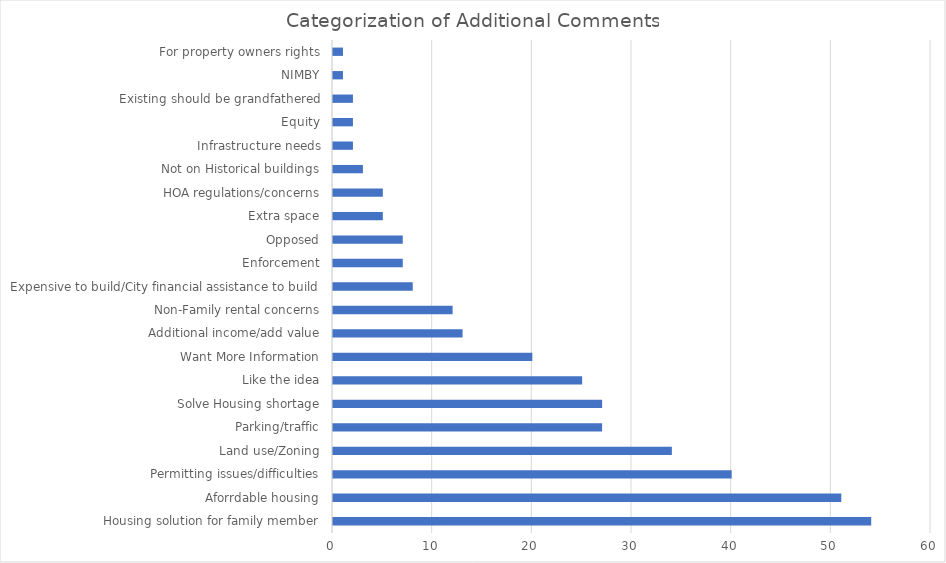
| Category | Series 0 |
|---|---|
| Housing solution for family member | 54 |
| Aforrdable housing | 51 |
| Permitting issues/difficulties | 40 |
| Land use/Zoning | 34 |
| Parking/traffic | 27 |
| Solve Housing shortage | 27 |
| Like the idea | 25 |
| Want More Information | 20 |
| Additional income/add value | 13 |
| Non-Family rental concerns | 12 |
| Expensive to build/City financial assistance to build | 8 |
| Enforcement | 7 |
| Opposed | 7 |
| Extra space | 5 |
| HOA regulations/concerns | 5 |
| Not on Historical buildings | 3 |
| Infrastructure needs | 2 |
| Equity | 2 |
| Existing should be grandfathered | 2 |
| NIMBY | 1 |
| For property owners rights | 1 |